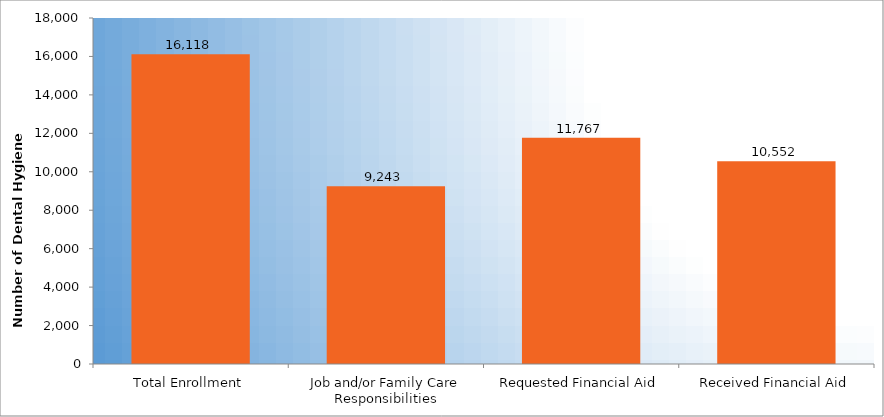
| Category | Number of Dental Hygiene Students |
|---|---|
| Total Enrollment | 16118 |
| Job and/or Family Care Responsibilities | 9243 |
| Requested Financial Aid | 11767 |
| Received Financial Aid | 10552 |